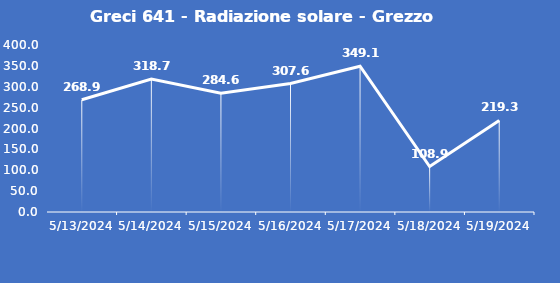
| Category | Greci 641 - Radiazione solare - Grezzo (W/m2) |
|---|---|
| 5/13/24 | 268.9 |
| 5/14/24 | 318.7 |
| 5/15/24 | 284.6 |
| 5/16/24 | 307.6 |
| 5/17/24 | 349.1 |
| 5/18/24 | 108.9 |
| 5/19/24 | 219.3 |